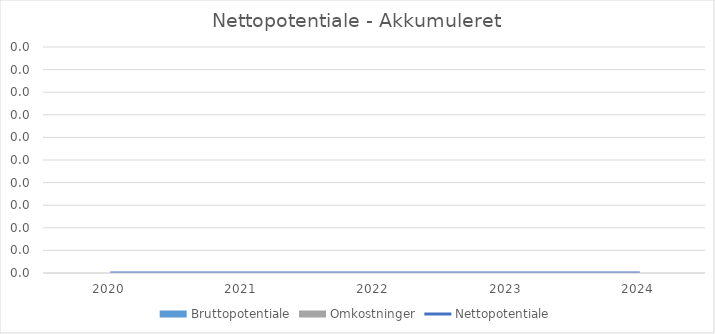
| Category | Bruttopotentiale | Omkostninger |
|---|---|---|
| 2020.0 | 0 | 0 |
| 2021.0 | 0 | 0 |
| 2022.0 | 0 | 0 |
| 2023.0 | 0 | 0 |
| 2024.0 | 0 | 0 |